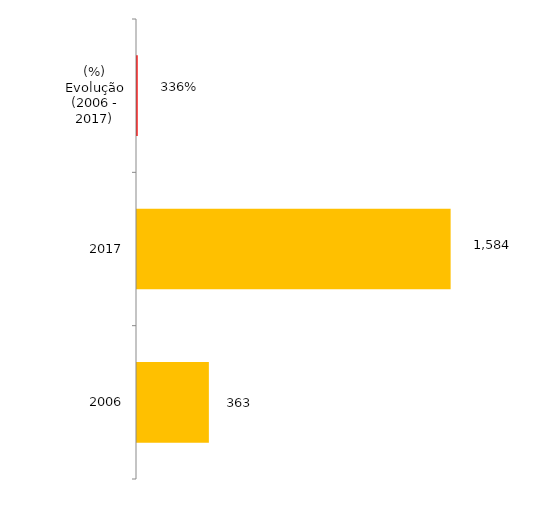
| Category | Total Geral |
|---|---|
| 2006 | 363 |
| 2017 | 1584 |
| (%) Evolução (2006 - 2017) | 3.364 |